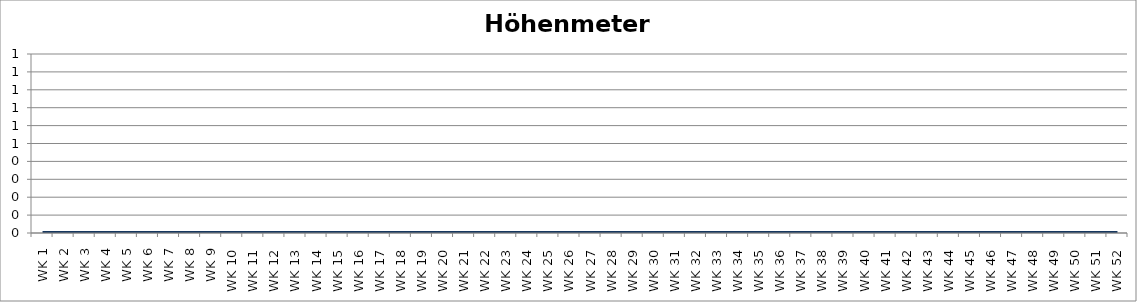
| Category | Höhenmeter |
|---|---|
| WK 1 | 0 |
| WK 2 | 0 |
| WK 3 | 0 |
| WK 4 | 0 |
| WK 5 | 0 |
| WK 6 | 0 |
| WK 7 | 0 |
| WK 8 | 0 |
| WK 9 | 0 |
| WK 10 | 0 |
| WK 11 | 0 |
| WK 12 | 0 |
| WK 13 | 0 |
| WK 14 | 0 |
| WK 15 | 0 |
| WK 16 | 0 |
| WK 17 | 0 |
| WK 18 | 0 |
| WK 19 | 0 |
| WK 20 | 0 |
| WK 21 | 0 |
| WK 22 | 0 |
| WK 23 | 0 |
| WK 24 | 0 |
| WK 25 | 0 |
| WK 26 | 0 |
| WK 27 | 0 |
| WK 28 | 0 |
| WK 29 | 0 |
| WK 30 | 0 |
| WK 31 | 0 |
| WK 32 | 0 |
| WK 33 | 0 |
| WK 34 | 0 |
| WK 35 | 0 |
| WK 36 | 0 |
| WK 37 | 0 |
| WK 38 | 0 |
| WK 39 | 0 |
| WK 40 | 0 |
| WK 41 | 0 |
| WK 42 | 0 |
| WK 43 | 0 |
| WK 44 | 0 |
| WK 45 | 0 |
| WK 46 | 0 |
| WK 47 | 0 |
| WK 48 | 0 |
| WK 49 | 0 |
| WK 50 | 0 |
| WK 51 | 0 |
| WK 52 | 0 |